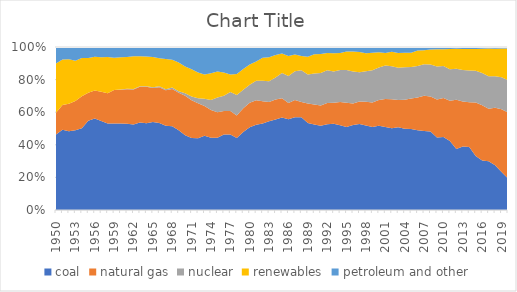
| Category | coal | natural gas | nuclear | renewables | petroleum and other |
|---|---|---|---|---|---|
| 1950.0 | 155 | 45 | 0 | 101 | 34 |
| 1951.0 | 185 | 57 | 0 | 105 | 29 |
| 1952.0 | 195 | 68 | 0 | 110 | 30 |
| 1953.0 | 219 | 80 | 0 | 110 | 38 |
| 1954.0 | 239 | 94 | 0 | 112 | 32 |
| 1955.0 | 301 | 95 | 0 | 117 | 37 |
| 1956.0 | 339 | 104 | 0 | 125 | 36 |
| 1957.0 | 346 | 114 | 0 | 134 | 40 |
| 1958.0 | 344 | 120 | 0 | 144 | 40 |
| 1959.0 | 378 | 147 | 0 | 141 | 47 |
| 1960.0 | 403 | 158 | 1 | 150 | 48 |
| 1961.0 | 422 | 169 | 2 | 156 | 49 |
| 1962.0 | 450 | 184 | 2 | 172 | 49 |
| 1963.0 | 494 | 202 | 3 | 169 | 52 |
| 1964.0 | 526 | 220 | 3 | 181 | 57 |
| 1965.0 | 571 | 222 | 4 | 197 | 65 |
| 1966.0 | 613 | 251 | 6 | 198 | 79 |
| 1967.0 | 630 | 265 | 8 | 226 | 89 |
| 1968.0 | 685 | 304 | 13 | 227 | 104 |
| 1969.0 | 706 | 333 | 14 | 254 | 138 |
| 1970.0 | 704 | 373 | 22 | 252 | 184 |
| 1971.0 | 713 | 374 | 38 | 270 | 220 |
| 1972.0 | 771 | 376 | 54 | 278 | 274 |
| 1973.0 | 848 | 341 | 83 | 278 | 314 |
| 1974.0 | 828 | 320 | 114 | 307 | 301 |
| 1975.0 | 853 | 300 | 173 | 307 | 289 |
| 1976.0 | 944 | 295 | 191 | 291 | 320 |
| 1977.0 | 985 | 306 | 251 | 228 | 358 |
| 1978.0 | 976 | 305 | 276 | 287 | 365 |
| 1979.0 | 1075 | 329 | 255 | 287 | 304 |
| 1980.0 | 1162 | 346 | 251 | 285 | 246 |
| 1981.0 | 1203 | 346 | 273 | 270 | 206 |
| 1982.0 | 1192 | 305 | 283 | 318 | 147 |
| 1983.0 | 1259 | 274 | 294 | 342 | 144 |
| 1984.0 | 1342 | 297 | 328 | 333 | 120 |
| 1985.0 | 1402 | 292 | 384 | 295 | 100 |
| 1986.0 | 1386 | 249 | 414 | 306 | 137 |
| 1987.0 | 1464 | 273 | 455 | 265 | 118 |
| 1988.0 | 1541 | 253 | 527 | 238 | 149 |
| 1989.0 | 1584 | 353 | 529 | 325 | 176 |
| 1990.0 | 1594 | 373 | 577 | 357 | 137 |
| 1991.0 | 1591 | 382 | 613 | 358 | 131 |
| 1992.0 | 1621 | 404 | 619 | 327 | 113 |
| 1993.0 | 1690 | 415 | 610 | 357 | 125 |
| 1994.0 | 1691 | 460 | 640 | 337 | 120 |
| 1995.0 | 1709 | 496 | 673 | 385 | 90 |
| 1996.0 | 1795 | 455 | 675 | 423 | 96 |
| 1997.0 | 1845 | 479 | 629 | 434 | 105 |
| 1998.0 | 1874 | 531 | 674 | 400 | 141 |
| 1999.0 | 1881 | 556 | 728 | 399 | 130 |
| 2000.0 | 1966 | 601 | 754 | 356 | 124 |
| 2001.0 | 1904 | 639 | 769 | 288 | 137 |
| 2002.0 | 1933 | 691 | 780 | 343 | 111 |
| 2003.0 | 1974 | 650 | 764 | 355 | 141 |
| 2004.0 | 1978 | 710 | 789 | 351 | 142 |
| 2005.0 | 2013 | 761 | 782 | 358 | 142 |
| 2006.0 | 1991 | 816 | 787 | 386 | 85 |
| 2007.0 | 2016 | 897 | 806 | 353 | 85 |
| 2008.0 | 1986 | 883 | 806 | 381 | 63 |
| 2009.0 | 1756 | 921 | 799 | 418 | 57 |
| 2010.0 | 1847 | 988 | 807 | 427 | 56 |
| 2011.0 | 1733 | 1014 | 790 | 513 | 49 |
| 2012.0 | 1514 | 1226 | 769 | 495 | 44 |
| 2013.0 | 1581 | 1125 | 789 | 522 | 49 |
| 2014.0 | 1582 | 1127 | 797 | 539 | 49 |
| 2015.0 | 1352 | 1335 | 797 | 544 | 50 |
| 2016.0 | 1239 | 1379 | 806 | 609 | 44 |
| 2017.0 | 1206 | 1298 | 805 | 687 | 40 |
| 2018.0 | 1149 | 1472 | 807 | 707 | 46 |
| 2019.0 | 965 | 1589 | 809 | 729 | 39 |
| 2020.0 | 773 | 1627 | 790 | 783 | 37 |